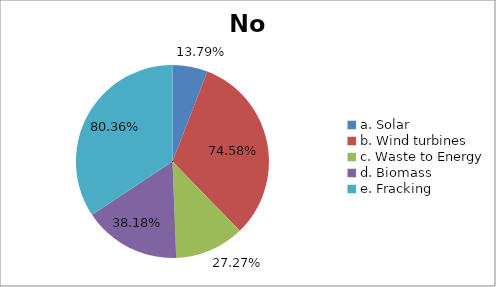
| Category | No |
|---|---|
| a. Solar | 0.138 |
| b. Wind turbines | 0.746 |
| c. Waste to Energy | 0.273 |
| d. Biomass | 0.382 |
| e. Fracking | 0.804 |